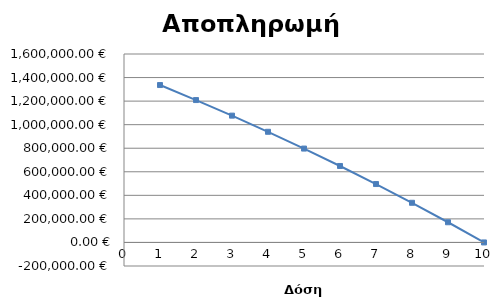
| Category | Series 0 |
|---|---|
| 1.0 | 1336395.847 |
| 2.0 | 1208973.11 |
| 3.0 | 1076733.794 |
| 4.0 | 939495.831 |
| 5.0 | 797070.274 |
| 6.0 | 649261.03 |
| 7.0 | 495864.597 |
| 8.0 | 336669.779 |
| 9.0 | 171457.396 |
| 10.0 | -0.014 |